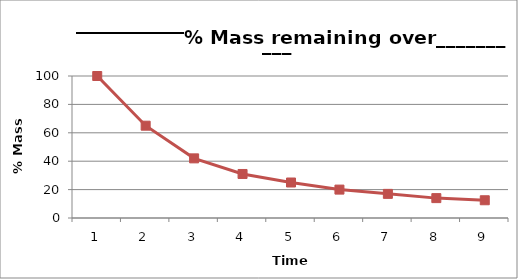
| Category | % Mass remaining |
|---|---|
| 0 | 100 |
| 1 | 65 |
| 2 | 42 |
| 3 | 31 |
| 4 | 25 |
| 5 | 20 |
| 6 | 17 |
| 7 | 14 |
| 8 | 12.5 |